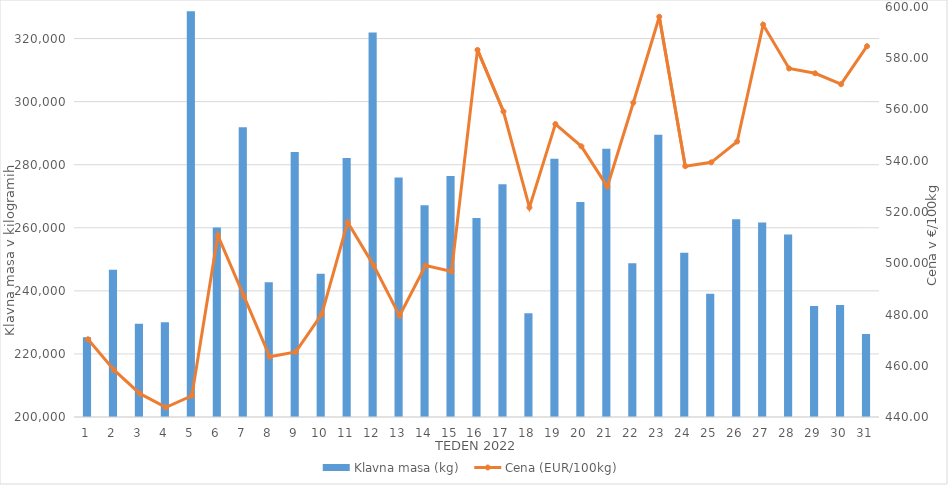
| Category | Klavna masa (kg) |
|---|---|
| 1.0 | 225300 |
| 2.0 | 246712 |
| 3.0 | 229541 |
| 4.0 | 230074 |
| 5.0 | 328640 |
| 6.0 | 260108 |
| 7.0 | 291887 |
| 8.0 | 242732 |
| 9.0 | 283987 |
| 10.0 | 245414 |
| 11.0 | 282092 |
| 12.0 | 321936 |
| 13.0 | 275950 |
| 14.0 | 267148 |
| 15.0 | 276417 |
| 16.0 | 263098 |
| 17.0 | 273824 |
| 18.0 | 232926 |
| 19.0 | 281859 |
| 20.0 | 268153 |
| 21.0 | 285073 |
| 22.0 | 248783 |
| 23.0 | 289478 |
| 24.0 | 252069 |
| 25.0 | 239099 |
| 26.0 | 262689 |
| 27.0 | 261656 |
| 28.0 | 257905 |
| 29.0 | 235185 |
| 30.0 | 235475 |
| 31.0 | 226322 |